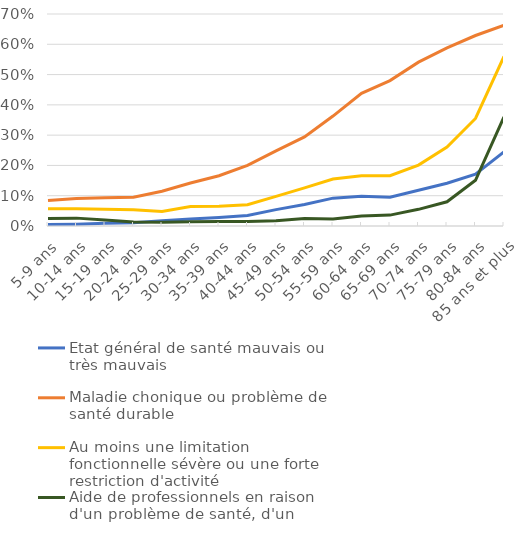
| Category | Etat général de santé mauvais ou très mauvais | Maladie chonique ou problème de santé durable | Au moins une limitation fonctionnelle sévère ou une forte restriction d'activité | Aide de professionnels en raison d'un problème de santé, d'un handicap ou de l'avancée en âge |
|---|---|---|---|---|
| 5-9 ans | 0.005 | 0.084 | 0.057 | 0.025 |
| 10-14 ans | 0.006 | 0.091 | 0.057 | 0.026 |
| 15-19 ans | 0.009 | 0.093 | 0.055 | 0.02 |
| 20-24 ans | 0.011 | 0.095 | 0.054 | 0.013 |
| 25-29 ans | 0.017 | 0.115 | 0.048 | 0.012 |
| 30-34 ans | 0.023 | 0.142 | 0.064 | 0.014 |
| 35-39 ans | 0.028 | 0.166 | 0.065 | 0.015 |
| 40-44 ans | 0.035 | 0.2 | 0.07 | 0.015 |
| 45-49 ans | 0.054 | 0.248 | 0.098 | 0.017 |
| 50-54 ans | 0.071 | 0.294 | 0.126 | 0.025 |
| 55-59 ans | 0.092 | 0.363 | 0.155 | 0.023 |
| 60-64 ans | 0.098 | 0.438 | 0.166 | 0.033 |
| 65-69 ans | 0.095 | 0.48 | 0.166 | 0.036 |
| 70-74 ans | 0.118 | 0.541 | 0.201 | 0.055 |
| 75-79 ans | 0.141 | 0.588 | 0.261 | 0.08 |
| 80-84 ans | 0.171 | 0.629 | 0.355 | 0.151 |
| 85 ans et plus | 0.245 | 0.663 | 0.56 | 0.36 |